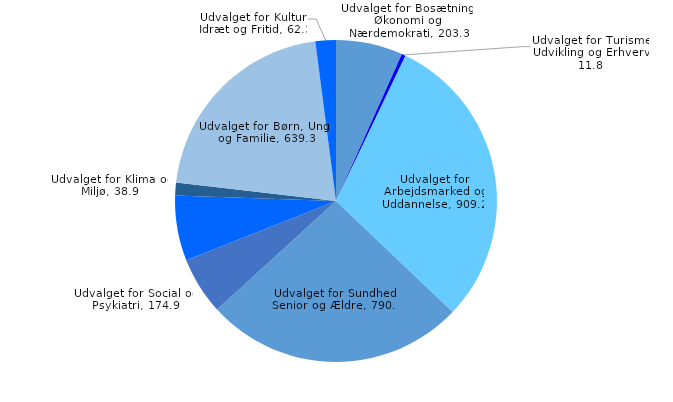
| Category | Series 0 |
|---|---|
| Udvalget for Bosætning, Økonomi og Nærdemokrati | 203.3 |
| Udvalget for Turisme, Udvikling og Erhverv | 11.8 |
| Udvalget for Arbejdsmarked og Uddannelse | 909.2 |
| Udvalget for Sundhed, Senior og Ældre | 790.9 |
| Udvalget for Social og Psykiatri | 174.9 |
| Udvalget for Plan og Teknik | 198.6 |
| Udvalget for Klima og Miljø | 38.9 |
| Udvalget for Børn, Unge og Familie | 639.3 |
| Udvalget for Kultur, Idræt og Fritid | 62.3 |